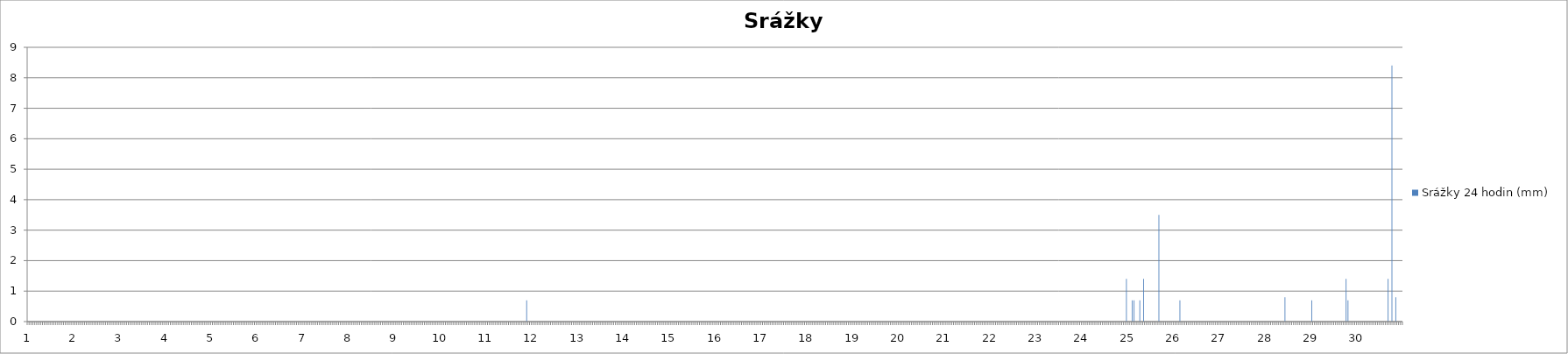
| Category | Srážky 24 hodin (mm) |
|---|---|
| 0 | 0 |
| 1 | 0 |
| 2 | 0 |
| 3 | 0 |
| 4 | 0 |
| 5 | 0 |
| 6 | 0 |
| 7 | 0 |
| 8 | 0 |
| 9 | 0 |
| 10 | 0 |
| 11 | 0 |
| 12 | 0 |
| 13 | 0 |
| 14 | 0 |
| 15 | 0 |
| 16 | 0 |
| 17 | 0 |
| 18 | 0 |
| 19 | 0 |
| 20 | 0 |
| 21 | 0 |
| 22 | 0 |
| 23 | 0 |
| 24 | 0 |
| 25 | 0 |
| 26 | 0 |
| 27 | 0 |
| 28 | 0 |
| 29 | 0 |
| 30 | 0 |
| 31 | 0 |
| 32 | 0 |
| 33 | 0 |
| 34 | 0 |
| 35 | 0 |
| 36 | 0 |
| 37 | 0 |
| 38 | 0 |
| 39 | 0 |
| 40 | 0 |
| 41 | 0 |
| 42 | 0 |
| 43 | 0 |
| 44 | 0 |
| 45 | 0 |
| 46 | 0 |
| 47 | 0 |
| 48 | 0 |
| 49 | 0 |
| 50 | 0 |
| 51 | 0 |
| 52 | 0 |
| 53 | 0 |
| 54 | 0 |
| 55 | 0 |
| 56 | 0 |
| 57 | 0 |
| 58 | 0 |
| 59 | 0 |
| 60 | 0 |
| 61 | 0 |
| 62 | 0 |
| 63 | 0 |
| 64 | 0 |
| 65 | 0 |
| 66 | 0 |
| 67 | 0 |
| 68 | 0 |
| 69 | 0 |
| 70 | 0 |
| 71 | 0 |
| 72 | 0 |
| 73 | 0 |
| 74 | 0 |
| 75 | 0 |
| 76 | 0 |
| 77 | 0 |
| 78 | 0 |
| 79 | 0 |
| 80 | 0 |
| 81 | 0 |
| 82 | 0 |
| 83 | 0 |
| 84 | 0 |
| 85 | 0 |
| 86 | 0 |
| 87 | 0 |
| 88 | 0 |
| 89 | 0 |
| 90 | 0 |
| 91 | 0 |
| 92 | 0 |
| 93 | 0 |
| 94 | 0 |
| 95 | 0 |
| 96 | 0 |
| 97 | 0 |
| 98 | 0 |
| 99 | 0 |
| 100 | 0 |
| 101 | 0 |
| 102 | 0 |
| 103 | 0 |
| 104 | 0 |
| 105 | 0 |
| 106 | 0 |
| 107 | 0 |
| 108 | 0 |
| 109 | 0 |
| 110 | 0 |
| 111 | 0 |
| 112 | 0 |
| 113 | 0 |
| 114 | 0 |
| 115 | 0 |
| 116 | 0 |
| 117 | 0 |
| 118 | 0 |
| 119 | 0 |
| 120 | 0 |
| 121 | 0 |
| 122 | 0 |
| 123 | 0 |
| 124 | 0 |
| 125 | 0 |
| 126 | 0 |
| 127 | 0 |
| 128 | 0 |
| 129 | 0 |
| 130 | 0 |
| 131 | 0 |
| 132 | 0 |
| 133 | 0 |
| 134 | 0 |
| 135 | 0 |
| 136 | 0 |
| 137 | 0 |
| 138 | 0 |
| 139 | 0 |
| 140 | 0 |
| 141 | 0 |
| 142 | 0 |
| 143 | 0 |
| 144 | 0 |
| 145 | 0 |
| 146 | 0 |
| 147 | 0 |
| 148 | 0 |
| 149 | 0 |
| 150 | 0 |
| 151 | 0 |
| 152 | 0 |
| 153 | 0 |
| 154 | 0 |
| 155 | 0 |
| 156 | 0 |
| 157 | 0 |
| 158 | 0 |
| 159 | 0 |
| 160 | 0 |
| 161 | 0 |
| 162 | 0 |
| 163 | 0 |
| 164 | 0 |
| 165 | 0 |
| 166 | 0 |
| 167 | 0 |
| 168 | 0 |
| 169 | 0 |
| 170 | 0 |
| 171 | 0 |
| 172 | 0 |
| 173 | 0 |
| 174 | 0 |
| 175 | 0 |
| 176 | 0 |
| 177 | 0 |
| 178 | 0 |
| 179 | 0 |
| 180 | 0 |
| 181 | 0 |
| 182 | 0 |
| 183 | 0 |
| 184 | 0 |
| 185 | 0 |
| 186 | 0 |
| 187 | 0 |
| 188 | 0 |
| 189 | 0 |
| 190 | 0 |
| 191 | 0 |
| 192 | 0 |
| 193 | 0 |
| 194 | 0 |
| 195 | 0 |
| 196 | 0 |
| 197 | 0 |
| 198 | 0 |
| 199 | 0 |
| 200 | 0 |
| 201 | 0 |
| 202 | 0 |
| 203 | 0 |
| 204 | 0 |
| 205 | 0 |
| 206 | 0 |
| 207 | 0 |
| 208 | 0 |
| 209 | 0 |
| 210 | 0 |
| 211 | 0 |
| 212 | 0 |
| 213 | 0 |
| 214 | 0 |
| 215 | 0 |
| 216 | 0 |
| 217 | 0 |
| 218 | 0 |
| 219 | 0 |
| 220 | 0 |
| 221 | 0 |
| 222 | 0 |
| 223 | 0 |
| 224 | 0 |
| 225 | 0 |
| 226 | 0 |
| 227 | 0 |
| 228 | 0 |
| 229 | 0 |
| 230 | 0 |
| 231 | 0 |
| 232 | 0 |
| 233 | 0 |
| 234 | 0 |
| 235 | 0 |
| 236 | 0 |
| 237 | 0 |
| 238 | 0 |
| 239 | 0 |
| 240 | 0 |
| 241 | 0 |
| 242 | 0 |
| 243 | 0 |
| 244 | 0 |
| 245 | 0 |
| 246 | 0 |
| 247 | 0 |
| 248 | 0 |
| 249 | 0 |
| 250 | 0 |
| 251 | 0 |
| 252 | 0 |
| 253 | 0 |
| 254 | 0 |
| 255 | 0 |
| 256 | 0 |
| 257 | 0 |
| 258 | 0 |
| 259 | 0 |
| 260 | 0 |
| 261 | 0.7 |
| 262 | 0 |
| 263 | 0 |
| 264 | 0 |
| 265 | 0 |
| 266 | 0 |
| 267 | 0 |
| 268 | 0 |
| 269 | 0 |
| 270 | 0 |
| 271 | 0 |
| 272 | 0 |
| 273 | 0 |
| 274 | 0 |
| 275 | 0 |
| 276 | 0 |
| 277 | 0 |
| 278 | 0 |
| 279 | 0 |
| 280 | 0 |
| 281 | 0 |
| 282 | 0 |
| 283 | 0 |
| 284 | 0 |
| 285 | 0 |
| 286 | 0 |
| 287 | 0 |
| 288 | 0 |
| 289 | 0 |
| 290 | 0 |
| 291 | 0 |
| 292 | 0 |
| 293 | 0 |
| 294 | 0 |
| 295 | 0 |
| 296 | 0 |
| 297 | 0 |
| 298 | 0 |
| 299 | 0 |
| 300 | 0 |
| 301 | 0 |
| 302 | 0 |
| 303 | 0 |
| 304 | 0 |
| 305 | 0 |
| 306 | 0 |
| 307 | 0 |
| 308 | 0 |
| 309 | 0 |
| 310 | 0 |
| 311 | 0 |
| 312 | 0 |
| 313 | 0 |
| 314 | 0 |
| 315 | 0 |
| 316 | 0 |
| 317 | 0 |
| 318 | 0 |
| 319 | 0 |
| 320 | 0 |
| 321 | 0 |
| 322 | 0 |
| 323 | 0 |
| 324 | 0 |
| 325 | 0 |
| 326 | 0 |
| 327 | 0 |
| 328 | 0 |
| 329 | 0 |
| 330 | 0 |
| 331 | 0 |
| 332 | 0 |
| 333 | 0 |
| 334 | 0 |
| 335 | 0 |
| 336 | 0 |
| 337 | 0 |
| 338 | 0 |
| 339 | 0 |
| 340 | 0 |
| 341 | 0 |
| 342 | 0 |
| 343 | 0 |
| 344 | 0 |
| 345 | 0 |
| 346 | 0 |
| 347 | 0 |
| 348 | 0 |
| 349 | 0 |
| 350 | 0 |
| 351 | 0 |
| 352 | 0 |
| 353 | 0 |
| 354 | 0 |
| 355 | 0 |
| 356 | 0 |
| 357 | 0 |
| 358 | 0 |
| 359 | 0 |
| 360 | 0 |
| 361 | 0 |
| 362 | 0 |
| 363 | 0 |
| 364 | 0 |
| 365 | 0 |
| 366 | 0 |
| 367 | 0 |
| 368 | 0 |
| 369 | 0 |
| 370 | 0 |
| 371 | 0 |
| 372 | 0 |
| 373 | 0 |
| 374 | 0 |
| 375 | 0 |
| 376 | 0 |
| 377 | 0 |
| 378 | 0 |
| 379 | 0 |
| 380 | 0 |
| 381 | 0 |
| 382 | 0 |
| 383 | 0 |
| 384 | 0 |
| 385 | 0 |
| 386 | 0 |
| 387 | 0 |
| 388 | 0 |
| 389 | 0 |
| 390 | 0 |
| 391 | 0 |
| 392 | 0 |
| 393 | 0 |
| 394 | 0 |
| 395 | 0 |
| 396 | 0 |
| 397 | 0 |
| 398 | 0 |
| 399 | 0 |
| 400 | 0 |
| 401 | 0 |
| 402 | 0 |
| 403 | 0 |
| 404 | 0 |
| 405 | 0 |
| 406 | 0 |
| 407 | 0 |
| 408 | 0 |
| 409 | 0 |
| 410 | 0 |
| 411 | 0 |
| 412 | 0 |
| 413 | 0 |
| 414 | 0 |
| 415 | 0 |
| 416 | 0 |
| 417 | 0 |
| 418 | 0 |
| 419 | 0 |
| 420 | 0 |
| 421 | 0 |
| 422 | 0 |
| 423 | 0 |
| 424 | 0 |
| 425 | 0 |
| 426 | 0 |
| 427 | 0 |
| 428 | 0 |
| 429 | 0 |
| 430 | 0 |
| 431 | 0 |
| 432 | 0 |
| 433 | 0 |
| 434 | 0 |
| 435 | 0 |
| 436 | 0 |
| 437 | 0 |
| 438 | 0 |
| 439 | 0 |
| 440 | 0 |
| 441 | 0 |
| 442 | 0 |
| 443 | 0 |
| 444 | 0 |
| 445 | 0 |
| 446 | 0 |
| 447 | 0 |
| 448 | 0 |
| 449 | 0 |
| 450 | 0 |
| 451 | 0 |
| 452 | 0 |
| 453 | 0 |
| 454 | 0 |
| 455 | 0 |
| 456 | 0 |
| 457 | 0 |
| 458 | 0 |
| 459 | 0 |
| 460 | 0 |
| 461 | 0 |
| 462 | 0 |
| 463 | 0 |
| 464 | 0 |
| 465 | 0 |
| 466 | 0 |
| 467 | 0 |
| 468 | 0 |
| 469 | 0 |
| 470 | 0 |
| 471 | 0 |
| 472 | 0 |
| 473 | 0 |
| 474 | 0 |
| 475 | 0 |
| 476 | 0 |
| 477 | 0 |
| 478 | 0 |
| 479 | 0 |
| 480 | 0 |
| 481 | 0 |
| 482 | 0 |
| 483 | 0 |
| 484 | 0 |
| 485 | 0 |
| 486 | 0 |
| 487 | 0 |
| 488 | 0 |
| 489 | 0 |
| 490 | 0 |
| 491 | 0 |
| 492 | 0 |
| 493 | 0 |
| 494 | 0 |
| 495 | 0 |
| 496 | 0 |
| 497 | 0 |
| 498 | 0 |
| 499 | 0 |
| 500 | 0 |
| 501 | 0 |
| 502 | 0 |
| 503 | 0 |
| 504 | 0 |
| 505 | 0 |
| 506 | 0 |
| 507 | 0 |
| 508 | 0 |
| 509 | 0 |
| 510 | 0 |
| 511 | 0 |
| 512 | 0 |
| 513 | 0 |
| 514 | 0 |
| 515 | 0 |
| 516 | 0 |
| 517 | 0 |
| 518 | 0 |
| 519 | 0 |
| 520 | 0 |
| 521 | 0 |
| 522 | 0 |
| 523 | 0 |
| 524 | 0 |
| 525 | 0 |
| 526 | 0 |
| 527 | 0 |
| 528 | 0 |
| 529 | 0 |
| 530 | 0 |
| 531 | 0 |
| 532 | 0 |
| 533 | 0 |
| 534 | 0 |
| 535 | 0 |
| 536 | 0 |
| 537 | 0 |
| 538 | 0 |
| 539 | 0 |
| 540 | 0 |
| 541 | 0 |
| 542 | 0 |
| 543 | 0 |
| 544 | 0 |
| 545 | 0 |
| 546 | 0 |
| 547 | 0 |
| 548 | 0 |
| 549 | 0 |
| 550 | 0 |
| 551 | 0 |
| 552 | 0 |
| 553 | 0 |
| 554 | 0 |
| 555 | 0 |
| 556 | 0 |
| 557 | 0 |
| 558 | 0 |
| 559 | 0 |
| 560 | 0 |
| 561 | 0 |
| 562 | 0 |
| 563 | 0 |
| 564 | 0 |
| 565 | 0 |
| 566 | 0 |
| 567 | 0 |
| 568 | 0 |
| 569 | 0 |
| 570 | 0 |
| 571 | 0 |
| 572 | 0 |
| 573 | 0 |
| 574 | 0 |
| 575 | 1.4 |
| 576 | 0 |
| 577 | 0 |
| 578 | 0.7 |
| 579 | 0.7 |
| 580 | 0 |
| 581 | 0 |
| 582 | 0.7 |
| 583 | 0 |
| 584 | 1.4 |
| 585 | 0 |
| 586 | 0 |
| 587 | 0 |
| 588 | 0 |
| 589 | 0 |
| 590 | 0 |
| 591 | 0 |
| 592 | 3.5 |
| 593 | 0 |
| 594 | 0 |
| 595 | 0 |
| 596 | 0 |
| 597 | 0 |
| 598 | 0 |
| 599 | 0 |
| 600 | 0 |
| 601 | 0 |
| 602 | 0 |
| 603 | 0.7 |
| 604 | 0 |
| 605 | 0 |
| 606 | 0 |
| 607 | 0 |
| 608 | 0 |
| 609 | 0 |
| 610 | 0 |
| 611 | 0 |
| 612 | 0 |
| 613 | 0 |
| 614 | 0 |
| 615 | 0 |
| 616 | 0 |
| 617 | 0 |
| 618 | 0 |
| 619 | 0 |
| 620 | 0 |
| 621 | 0 |
| 622 | 0 |
| 623 | 0 |
| 624 | 0 |
| 625 | 0 |
| 626 | 0 |
| 627 | 0 |
| 628 | 0 |
| 629 | 0 |
| 630 | 0 |
| 631 | 0 |
| 632 | 0 |
| 633 | 0 |
| 634 | 0 |
| 635 | 0 |
| 636 | 0 |
| 637 | 0 |
| 638 | 0 |
| 639 | 0 |
| 640 | 0 |
| 641 | 0 |
| 642 | 0 |
| 643 | 0 |
| 644 | 0 |
| 645 | 0 |
| 646 | 0 |
| 647 | 0 |
| 648 | 0 |
| 649 | 0 |
| 650 | 0 |
| 651 | 0 |
| 652 | 0 |
| 653 | 0 |
| 654 | 0 |
| 655 | 0 |
| 656 | 0 |
| 657 | 0 |
| 658 | 0.8 |
| 659 | 0 |
| 660 | 0 |
| 661 | 0 |
| 662 | 0 |
| 663 | 0 |
| 664 | 0 |
| 665 | 0 |
| 666 | 0 |
| 667 | 0 |
| 668 | 0 |
| 669 | 0 |
| 670 | 0 |
| 671 | 0 |
| 672 | 0.7 |
| 673 | 0 |
| 674 | 0 |
| 675 | 0 |
| 676 | 0 |
| 677 | 0 |
| 678 | 0 |
| 679 | 0 |
| 680 | 0 |
| 681 | 0 |
| 682 | 0 |
| 683 | 0 |
| 684 | 0 |
| 685 | 0 |
| 686 | 0 |
| 687 | 0 |
| 688 | 0 |
| 689 | 0 |
| 690 | 1.4 |
| 691 | 0.7 |
| 692 | 0 |
| 693 | 0 |
| 694 | 0 |
| 695 | 0 |
| 696 | 0 |
| 697 | 0 |
| 698 | 0 |
| 699 | 0 |
| 700 | 0 |
| 701 | 0 |
| 702 | 0 |
| 703 | 0 |
| 704 | 0 |
| 705 | 0 |
| 706 | 0 |
| 707 | 0 |
| 708 | 0 |
| 709 | 0 |
| 710 | 0 |
| 711 | 0 |
| 712 | 1.4 |
| 713 | 0 |
| 714 | 8.4 |
| 715 | 0 |
| 716 | 0.8 |
| 717 | 0 |
| 718 | 0 |
| 719 | 0 |